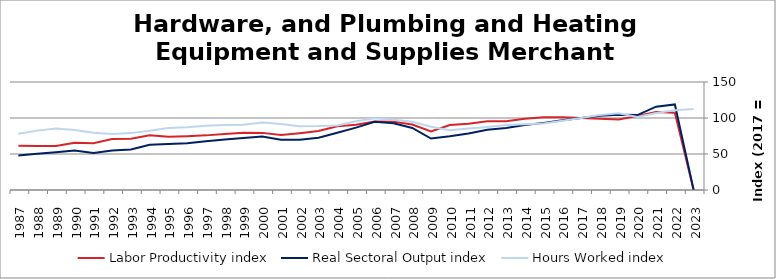
| Category | Labor Productivity index | Real Sectoral Output index | Hours Worked index |
|---|---|---|---|
| 2023.0 | 0 | 0 | 112.438 |
| 2022.0 | 107.248 | 118.832 | 110.802 |
| 2021.0 | 108.231 | 115.741 | 106.939 |
| 2020.0 | 102.678 | 104.059 | 101.346 |
| 2019.0 | 97.984 | 104.427 | 106.576 |
| 2018.0 | 99.074 | 103.256 | 104.222 |
| 2017.0 | 100 | 100 | 100 |
| 2016.0 | 100.914 | 96.931 | 96.053 |
| 2015.0 | 100.873 | 93.222 | 92.415 |
| 2014.0 | 98.815 | 90.337 | 91.42 |
| 2013.0 | 95.449 | 86.182 | 90.291 |
| 2012.0 | 95.35 | 83.57 | 87.646 |
| 2011.0 | 91.964 | 78.6 | 85.468 |
| 2010.0 | 90.142 | 74.698 | 82.868 |
| 2009.0 | 81.411 | 71.426 | 87.735 |
| 2008.0 | 90.947 | 86.135 | 94.709 |
| 2007.0 | 94.764 | 92.579 | 97.694 |
| 2006.0 | 95.131 | 94.769 | 99.62 |
| 2005.0 | 90.686 | 86.661 | 95.561 |
| 2004.0 | 88.663 | 79.555 | 89.727 |
| 2003.0 | 81.933 | 72.697 | 88.727 |
| 2002.0 | 78.849 | 69.767 | 88.482 |
| 2001.0 | 76.24 | 69.76 | 91.501 |
| 2000.0 | 79.335 | 74.275 | 93.622 |
| 1999.0 | 79.609 | 72.241 | 90.744 |
| 1998.0 | 77.838 | 70.215 | 90.207 |
| 1997.0 | 75.87 | 67.694 | 89.224 |
| 1996.0 | 74.773 | 65.095 | 87.057 |
| 1995.0 | 73.956 | 63.792 | 86.257 |
| 1994.0 | 76.132 | 62.752 | 82.425 |
| 1993.0 | 71.268 | 56.304 | 79.004 |
| 1992.0 | 70.717 | 54.964 | 77.724 |
| 1991.0 | 64.827 | 51.47 | 79.396 |
| 1990.0 | 65.662 | 54.707 | 83.315 |
| 1989.0 | 61.18 | 52.27 | 85.436 |
| 1988.0 | 61.078 | 50.369 | 82.466 |
| 1987.0 | 61.444 | 48 | 78.12 |